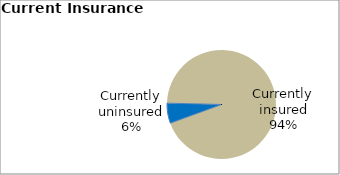
| Category | Series 0 |
|---|---|
| Currently uninsured | 5.949 |
| Currently insured | 94.051 |